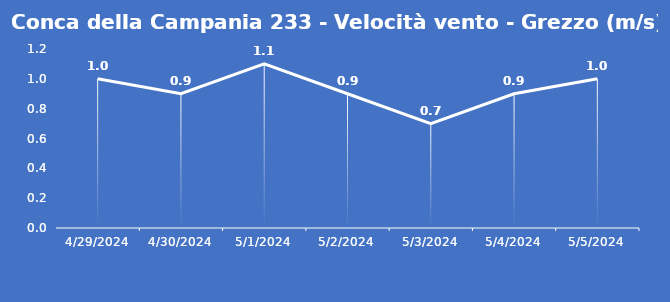
| Category | Conca della Campania 233 - Velocità vento - Grezzo (m/s) |
|---|---|
| 4/29/24 | 1 |
| 4/30/24 | 0.9 |
| 5/1/24 | 1.1 |
| 5/2/24 | 0.9 |
| 5/3/24 | 0.7 |
| 5/4/24 | 0.9 |
| 5/5/24 | 1 |